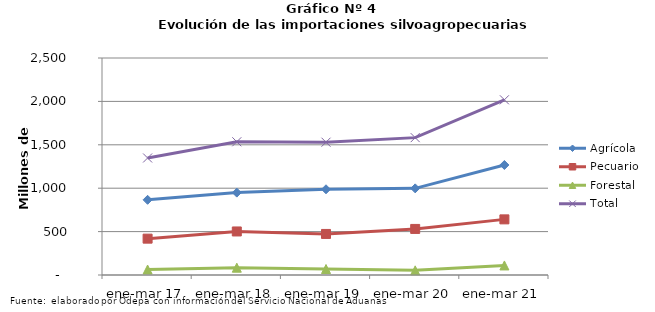
| Category | Agrícola | Pecuario | Forestal | Total |
|---|---|---|---|---|
| ene-mar 17 | 866051 | 418756 | 63155 | 1347962 |
| ene-mar 18 | 949131 | 501520 | 84236 | 1534887 |
| ene-mar 19 | 987658 | 472977 | 69124 | 1529759 |
| ene-mar 20 | 998091 | 530824 | 53671 | 1582586 |
| ene-mar 21 | 1267396 | 640890 | 110154 | 2018440 |